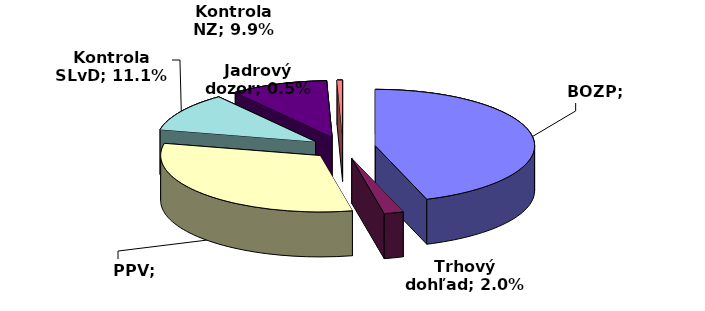
| Category | Series 0 |
|---|---|
| BOZP | 120138.9 |
| Trhový dohľad | 5287.2 |
| PPV | 85143.7 |
| Kontrola SLvD | 29894.7 |
| Kontrola NZ | 26450.1 |
| Jadrový dozor | 1474.1 |